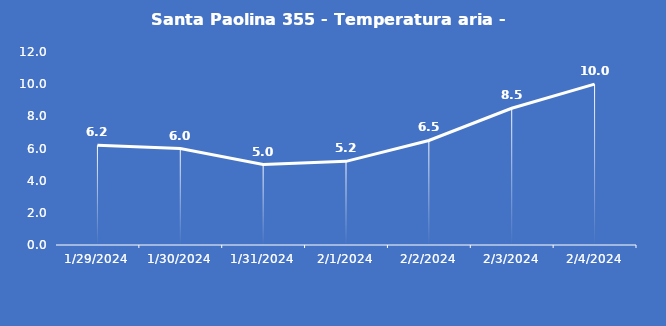
| Category | Santa Paolina 355 - Temperatura aria - Grezzo (°C) |
|---|---|
| 1/29/24 | 6.2 |
| 1/30/24 | 6 |
| 1/31/24 | 5 |
| 2/1/24 | 5.2 |
| 2/2/24 | 6.5 |
| 2/3/24 | 8.5 |
| 2/4/24 | 10 |